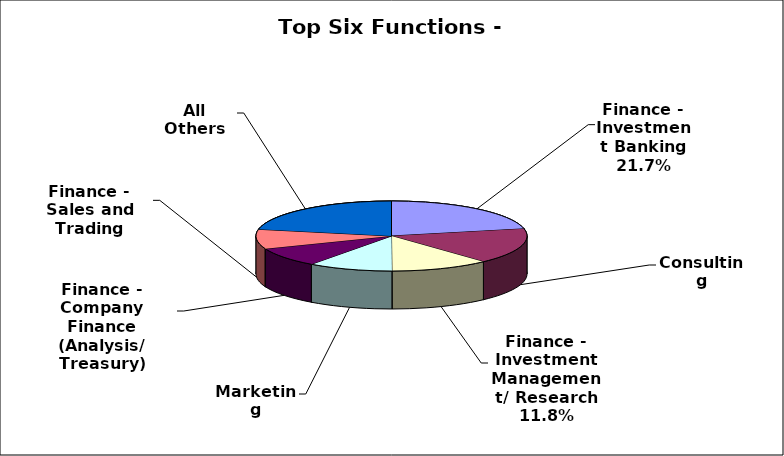
| Category | Series 0 |
|---|---|
| Finance - Investment Banking | 0.217 |
| Consulting | 0.164 |
| Finance - Investment Management/ Research | 0.118 |
| Marketing | 0.101 |
| Finance - Company Finance (Analysis/ Treasury) | 0.09 |
| Finance - Sales and Trading | 0.09 |
| All Others | 0.219 |